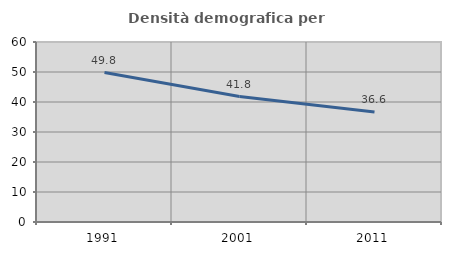
| Category | Densità demografica |
|---|---|
| 1991.0 | 49.82 |
| 2001.0 | 41.802 |
| 2011.0 | 36.646 |